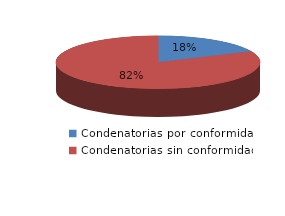
| Category | Series 0 |
|---|---|
| 0 | 10 |
| 1 | 45 |